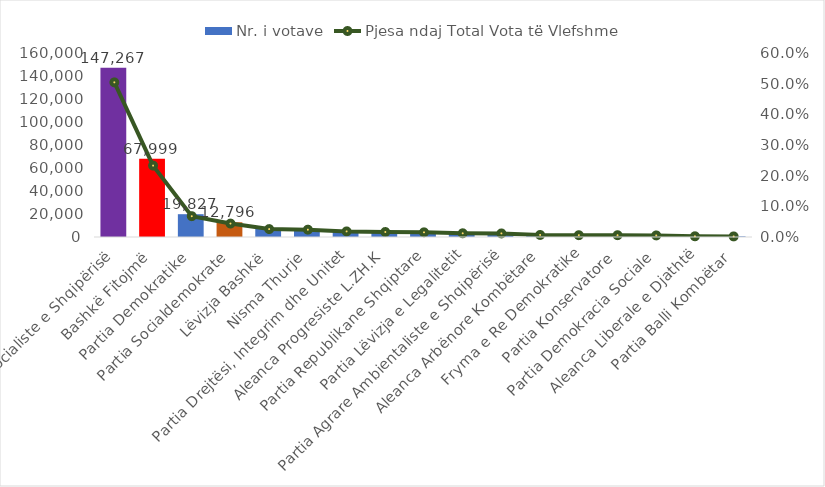
| Category | Nr. i votave |
|---|---|
| Partia Socialiste e Shqipërisë | 147267 |
| Bashkë Fitojmë | 67999 |
| Partia Demokratike | 19827 |
| Partia Socialdemokrate | 12796 |
| Lëvizja Bashkë | 7538 |
| Nisma Thurje | 6993 |
| Partia Drejtësi, Integrim dhe Unitet | 5313 |
| Aleanca Progresiste L.ZH.K | 4759 |
| Partia Republikane Shqiptare | 4454 |
| Partia Lëvizja e Legalitetit | 3529 |
| Partia Agrare Ambientaliste e Shqipërisë | 3396 |
| Aleanca Arbënore Kombëtare | 1957 |
| Fryma e Re Demokratike | 1735 |
| Partia Konservatore | 1723 |
| Partia Demokracia Sociale | 1509 |
| Aleanca Liberale e Djathtë | 694 |
| Partia Balli Kombëtar | 555 |